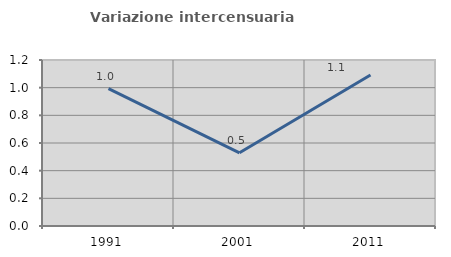
| Category | Variazione intercensuaria annua |
|---|---|
| 1991.0 | 0.993 |
| 2001.0 | 0.529 |
| 2011.0 | 1.092 |